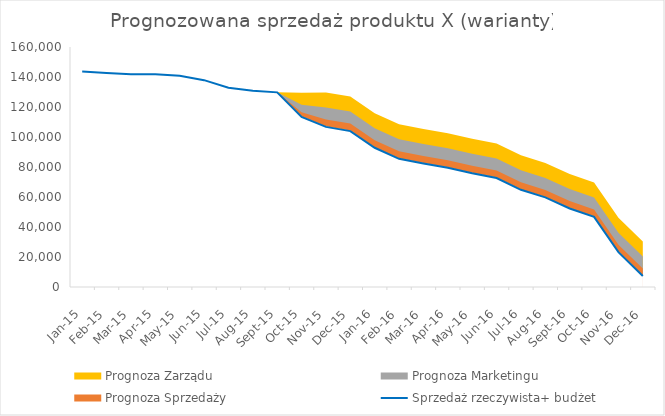
| Category | Sprzedaż rzeczywista+ budżet |
|---|---|
| 2015-01-01 | 143678 |
| 2015-02-01 | 142678 |
| 2015-03-01 | 141893 |
| 2015-04-01 | 141788 |
| 2015-05-01 | 140784 |
| 2015-06-01 | 137892 |
| 2015-07-01 | 132789 |
| 2015-08-01 | 130893 |
| 2015-09-01 | 129764 |
| 2015-10-01 | 113422 |
| 2015-11-01 | 106732 |
| 2015-12-01 | 103942 |
| 2016-01-01 | 92832 |
| 2016-02-01 | 85433 |
| 2016-03-01 | 82342 |
| 2016-04-01 | 79467 |
| 2016-05-01 | 75789 |
| 2016-06-01 | 72678 |
| 2016-07-01 | 64788 |
| 2016-08-01 | 59734 |
| 2016-09-01 | 52356 |
| 2016-10-01 | 46728 |
| 2016-11-01 | 23213 |
| 2016-12-01 | 7322 |